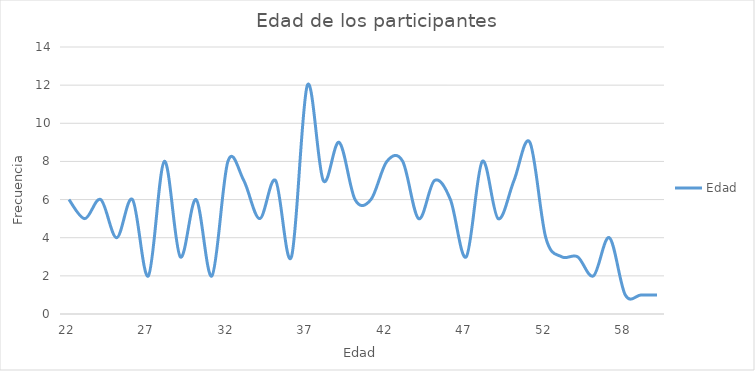
| Category | Edad |
|---|---|
| 22.0 | 6 |
| 23.0 | 5 |
| 24.0 | 6 |
| 25.0 | 4 |
| 26.0 | 6 |
| 27.0 | 2 |
| 28.0 | 8 |
| 29.0 | 3 |
| 30.0 | 6 |
| 31.0 | 2 |
| 32.0 | 8 |
| 33.0 | 7 |
| 34.0 | 5 |
| 35.0 | 7 |
| 36.0 | 3 |
| 37.0 | 12 |
| 38.0 | 7 |
| 39.0 | 9 |
| 40.0 | 6 |
| 41.0 | 6 |
| 42.0 | 8 |
| 43.0 | 8 |
| 44.0 | 5 |
| 45.0 | 7 |
| 46.0 | 6 |
| 47.0 | 3 |
| 48.0 | 8 |
| 49.0 | 5 |
| 50.0 | 7 |
| 51.0 | 9 |
| 52.0 | 4 |
| 53.0 | 3 |
| 54.0 | 3 |
| 56.0 | 2 |
| 57.0 | 4 |
| 58.0 | 1 |
| 59.0 | 1 |
| 60.0 | 1 |